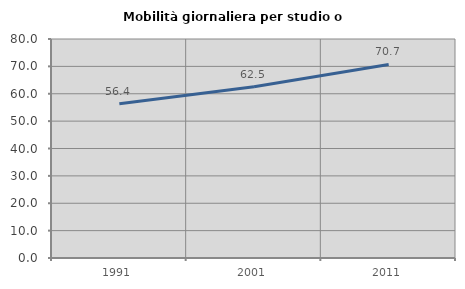
| Category | Mobilità giornaliera per studio o lavoro |
|---|---|
| 1991.0 | 56.383 |
| 2001.0 | 62.53 |
| 2011.0 | 70.712 |